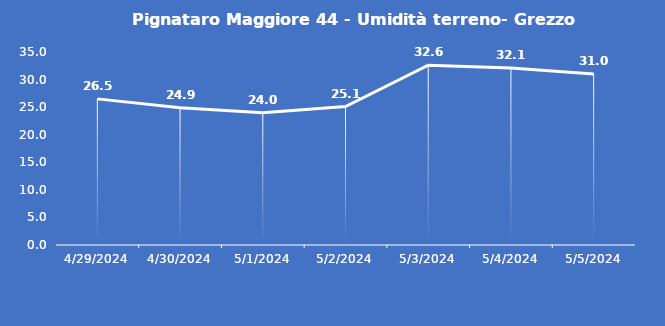
| Category | Pignataro Maggiore 44 - Umidità terreno- Grezzo (%VWC) |
|---|---|
| 4/29/24 | 26.5 |
| 4/30/24 | 24.9 |
| 5/1/24 | 24 |
| 5/2/24 | 25.1 |
| 5/3/24 | 32.6 |
| 5/4/24 | 32.1 |
| 5/5/24 | 31 |